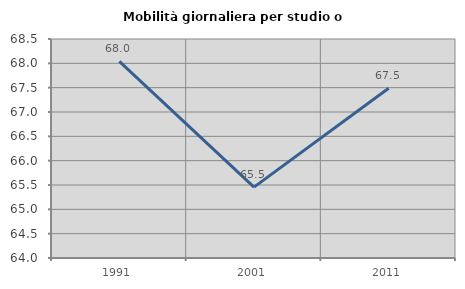
| Category | Mobilità giornaliera per studio o lavoro |
|---|---|
| 1991.0 | 68.038 |
| 2001.0 | 65.457 |
| 2011.0 | 67.488 |